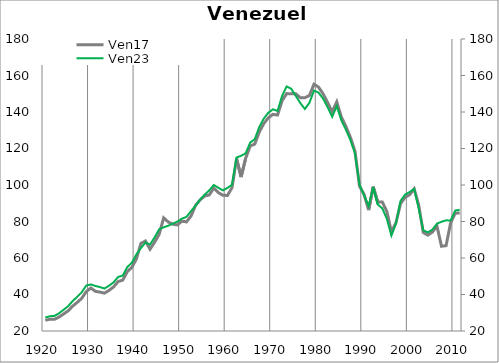
| Category | Ven17 |
|---|---|
| 1920.0 | 25.91 |
| 1921.0 | 26.41 |
| 1922.0 | 26.394 |
| 1923.0 | 27.591 |
| 1924.0 | 29.303 |
| 1925.0 | 31.006 |
| 1926.0 | 33.594 |
| 1927.0 | 35.656 |
| 1928.0 | 37.893 |
| 1929.0 | 41.575 |
| 1930.0 | 43.562 |
| 1931.0 | 41.736 |
| 1932.0 | 41.327 |
| 1933.0 | 40.74 |
| 1934.0 | 42.239 |
| 1935.0 | 44.161 |
| 1936.0 | 47.116 |
| 1937.0 | 47.866 |
| 1938.0 | 52.517 |
| 1939.0 | 54.831 |
| 1940.0 | 59.413 |
| 1941.0 | 68.024 |
| 1942.0 | 69.318 |
| 1943.0 | 64.818 |
| 1944.0 | 68.605 |
| 1945.0 | 72.967 |
| 1946.0 | 82.013 |
| 1947.0 | 79.711 |
| 1948.0 | 78.525 |
| 1949.0 | 78.122 |
| 1950.0 | 80.207 |
| 1951.0 | 79.781 |
| 1952.0 | 82.998 |
| 1953.0 | 88.857 |
| 1954.0 | 91.818 |
| 1955.0 | 93.962 |
| 1956.0 | 94.543 |
| 1957.0 | 98.305 |
| 1958.0 | 95.806 |
| 1959.0 | 94.386 |
| 1960.0 | 94.267 |
| 1961.0 | 98.523 |
| 1962.0 | 114.443 |
| 1963.0 | 104.366 |
| 1964.0 | 114.679 |
| 1965.0 | 121.406 |
| 1966.0 | 122.436 |
| 1967.0 | 129.079 |
| 1968.0 | 133.71 |
| 1969.0 | 136.885 |
| 1970.0 | 138.699 |
| 1971.0 | 138.33 |
| 1972.0 | 146.181 |
| 1973.0 | 150.079 |
| 1974.0 | 149.983 |
| 1975.0 | 149.968 |
| 1976.0 | 147.859 |
| 1977.0 | 147.845 |
| 1978.0 | 149.049 |
| 1979.0 | 155.214 |
| 1980.0 | 153.647 |
| 1981.0 | 149.983 |
| 1982.0 | 145.173 |
| 1983.0 | 140.194 |
| 1984.0 | 145.556 |
| 1985.0 | 137.319 |
| 1986.0 | 132.139 |
| 1987.0 | 126.057 |
| 1988.0 | 118.534 |
| 1989.0 | 99.318 |
| 1990.0 | 94.884 |
| 1991.0 | 86.237 |
| 1992.0 | 99.089 |
| 1993.0 | 90.596 |
| 1994.0 | 90.706 |
| 1995.0 | 85.473 |
| 1996.0 | 74.379 |
| 1997.0 | 79.334 |
| 1998.0 | 89.754 |
| 1999.0 | 93.212 |
| 2000.0 | 94.647 |
| 2001.0 | 97.903 |
| 2002.0 | 88.899 |
| 2003.0 | 73.967 |
| 2004.0 | 72.517 |
| 2005.0 | 74.208 |
| 2006.0 | 77.5 |
| 2007.0 | 66.418 |
| 2008.0 | 66.78 |
| 2009.0 | 79.137 |
| 2010.0 | 84.502 |
| 2011.0 | 84.717 |